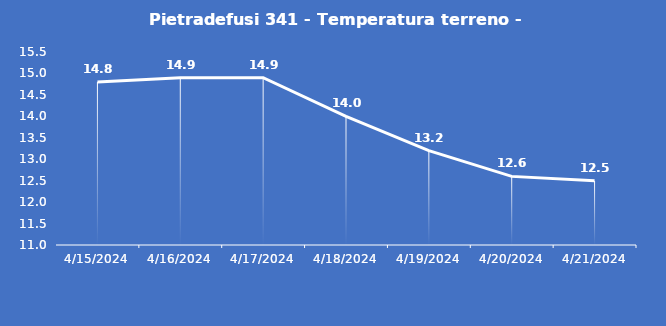
| Category | Pietradefusi 341 - Temperatura terreno - Grezzo (°C) |
|---|---|
| 4/15/24 | 14.8 |
| 4/16/24 | 14.9 |
| 4/17/24 | 14.9 |
| 4/18/24 | 14 |
| 4/19/24 | 13.2 |
| 4/20/24 | 12.6 |
| 4/21/24 | 12.5 |